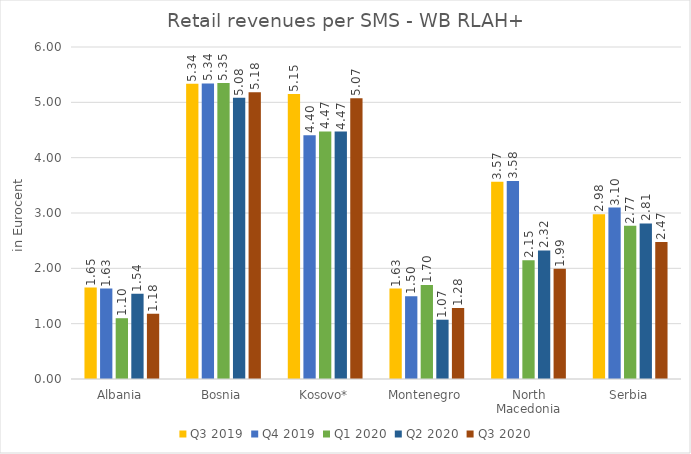
| Category | Q3 2019 | Q4 2019 | Q1 2020 | Q2 2020 | Q3 2020 |
|---|---|---|---|---|---|
| Albania | 1.652 | 1.634 | 1.099 | 1.54 | 1.18 |
| Bosnia | 5.336 | 5.342 | 5.348 | 5.081 | 5.182 |
| Kosovo* | 5.151 | 4.404 | 4.474 | 4.473 | 5.073 |
| Montenegro | 1.634 | 1.496 | 1.7 | 1.072 | 1.285 |
| North Macedonia | 3.565 | 3.577 | 2.147 | 2.323 | 1.99 |
| Serbia | 2.977 | 3.099 | 2.77 | 2.81 | 2.475 |